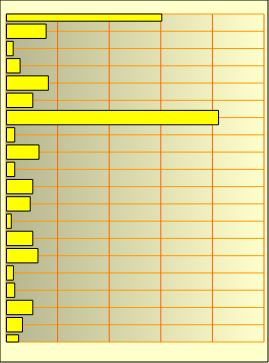
| Category | Series 0 |
|---|---|
| 0 | 600 |
| 1 | 151.7 |
| 2 | 24 |
| 3 | 50.8 |
| 4 | 160.33 |
| 5 | 100 |
| 6 | 820 |
| 7 | 30 |
| 8 | 124 |
| 9 | 30 |
| 10 | 100 |
| 11 | 90 |
| 12 | 16.667 |
| 13 | 100 |
| 14 | 120 |
| 15 | 25 |
| 16 | 30 |
| 17 | 100 |
| 18 | 60 |
| 19 | 45 |